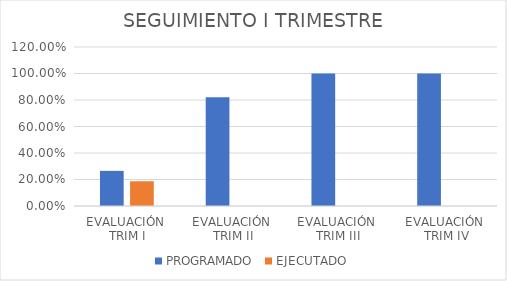
| Category | PROGRAMADO | EJECUTADO |
|---|---|---|
| EVALUACIÓN 
TRIM I | 0.265 | 0.187 |
| EVALUACIÓN 
TRIM II | 0.821 | 0 |
| EVALUACIÓN 
TRIM III | 1 | 0 |
| EVALUACIÓN
 TRIM IV | 1 | 0 |